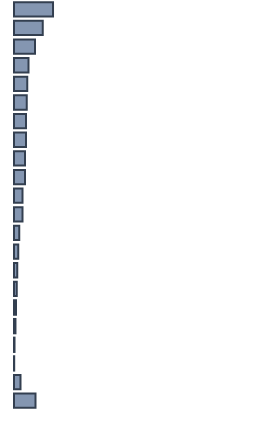
| Category | Percentatge |
|---|---|
| 0 | 16.259 |
| 1 | 11.959 |
| 2 | 8.776 |
| 3 | 6.075 |
| 4 | 5.546 |
| 5 | 5.29 |
| 6 | 5.046 |
| 7 | 4.987 |
| 8 | 4.598 |
| 9 | 4.565 |
| 10 | 3.564 |
| 11 | 3.519 |
| 12 | 2.206 |
| 13 | 1.754 |
| 14 | 1.362 |
| 15 | 1.131 |
| 16 | 0.848 |
| 17 | 0.612 |
| 18 | 0.217 |
| 19 | 0.082 |
| 20 | 2.684 |
| 21 | 8.92 |